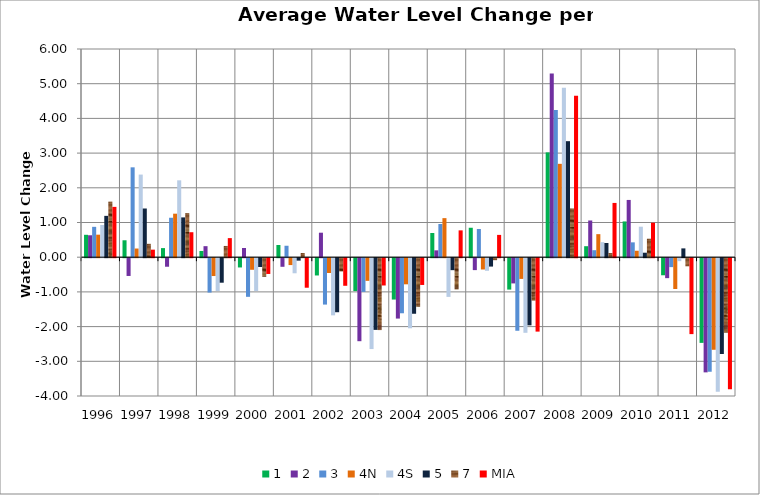
| Category | 1 | 2 | 3 | 4N | 4S | 5 | 7 | MIA |
|---|---|---|---|---|---|---|---|---|
| 1996.0 | 0.646 | 0.632 | 0.875 | 0.649 | 0.928 | 1.191 | 1.602 | 1.45 |
| 1997.0 | 0.488 | -0.512 | 2.59 | 0.25 | 2.381 | 1.403 | 0.386 | 0.218 |
| 1998.0 | 0.262 | -0.246 | 1.137 | 1.254 | 2.216 | 1.147 | 1.27 | 0.72 |
| 1999.0 | 0.18 | 0.318 | -0.99 | -0.514 | -0.947 | -0.706 | 0.324 | 0.55 |
| 2000.0 | -0.267 | 0.265 | -1.113 | -0.334 | -0.947 | -0.254 | -0.533 | -0.454 |
| 2001.0 | 0.352 | -0.248 | 0.33 | -0.198 | -0.434 | -0.07 | 0.12 | -0.851 |
| 2002.0 | -0.498 | 0.706 | -1.337 | -0.426 | -1.647 | -1.557 | -0.382 | -0.795 |
| 2003.0 | -0.948 | -2.392 | -0.971 | -0.652 | -2.618 | -2.066 | -2.072 | -0.786 |
| 2004.0 | -1.192 | -1.74 | -1.587 | -0.752 | -2.02 | -1.601 | -1.402 | -0.771 |
| 2005.0 | 0.697 | 0.198 | 0.956 | 1.126 | -1.115 | -0.345 | -0.9 | 0.773 |
| 2006.0 | 0.849 | -0.343 | 0.813 | -0.325 | -0.363 | -0.241 | -0.057 | 0.643 |
| 2007.0 | -0.904 | -0.727 | -2.091 | -0.597 | -2.15 | -1.935 | -1.222 | -2.116 |
| 2008.0 | 3.021 | 5.298 | 4.24 | 2.691 | 4.887 | 3.344 | 1.405 | 4.655 |
| 2009.0 | 0.317 | 1.058 | 0.202 | 0.664 | 0.433 | 0.409 | 0.121 | 1.564 |
| 2010.0 | 1.03 | 1.65 | 0.428 | 0.186 | 0.879 | 0.129 | 0.533 | 0.994 |
| 2011.0 | -0.492 | -0.575 | -0.257 | -0.888 | -0.085 | 0.254 | -0.234 | -2.188 |
| 2012.0 | -2.44 | -3.29 | -3.272 | -2.639 | -3.847 | -2.761 | -2.147 | -3.778 |